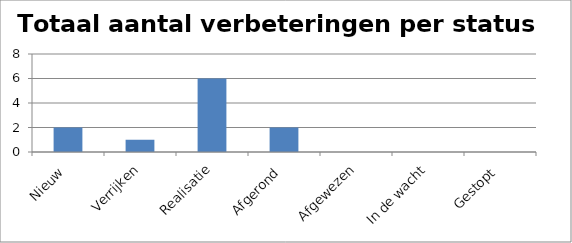
| Category | Totaal aantal verbeteringen per status |
|---|---|
| Nieuw | 2 |
| Verrijken | 1 |
| Realisatie | 6 |
| Afgerond | 2 |
| Afgewezen | 0 |
| In de wacht | 0 |
| Gestopt | 0 |